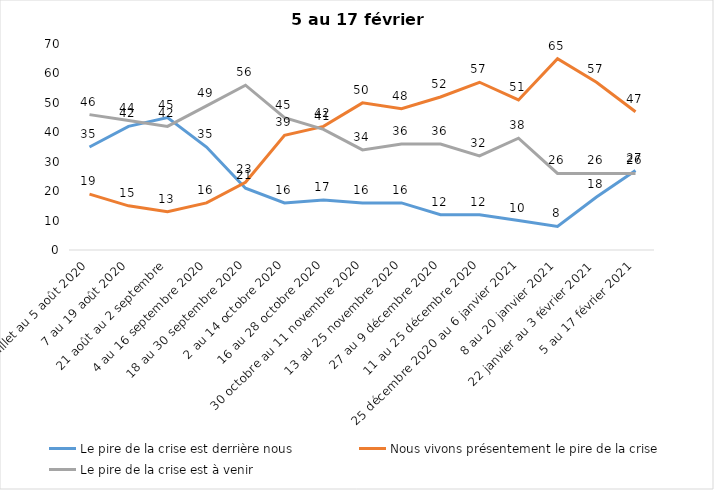
| Category | Le pire de la crise est derrière nous | Nous vivons présentement le pire de la crise | Le pire de la crise est à venir |
|---|---|---|---|
| 24 juillet au 5 août 2020 | 35 | 19 | 46 |
| 7 au 19 août 2020 | 42 | 15 | 44 |
| 21 août au 2 septembre | 45 | 13 | 42 |
| 4 au 16 septembre 2020 | 35 | 16 | 49 |
| 18 au 30 septembre 2020 | 21 | 23 | 56 |
| 2 au 14 octobre 2020 | 16 | 39 | 45 |
| 16 au 28 octobre 2020 | 17 | 42 | 41 |
| 30 octobre au 11 novembre 2020 | 16 | 50 | 34 |
| 13 au 25 novembre 2020 | 16 | 48 | 36 |
| 27 au 9 décembre 2020 | 12 | 52 | 36 |
| 11 au 25 décembre 2020 | 12 | 57 | 32 |
| 25 décembre 2020 au 6 janvier 2021 | 10 | 51 | 38 |
| 8 au 20 janvier 2021 | 8 | 65 | 26 |
| 22 janvier au 3 février 2021 | 18 | 57 | 26 |
| 5 au 17 février 2021 | 27 | 47 | 26 |